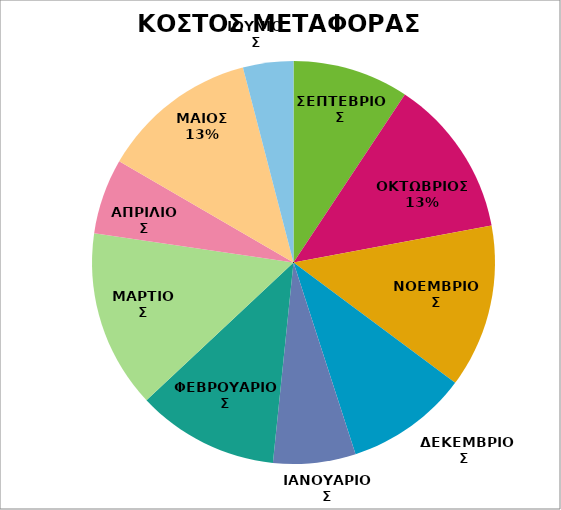
| Category | Series 0 |
|---|---|
| ΣΕΠΤΕΒΡΙΟΣ | 1703.48 |
| ΟΚΤΩΒΡΙΟΣ  | 2327.75 |
| ΝΟΕΜΒΡΙΟΣ | 2398.66 |
| ΔΕΚΕΜΒΡΙΟΣ  | 1796.54 |
| ΙΑΝΟΥΑΡΙΟΣ | 1208.99 |
| ΦΕΒΡΟΥΑΡΙΟΣ | 2080.44 |
| ΜΑΡΤΙΟΣ | 2615.14 |
| ΑΠΡΙΛΙΟΣ | 1104.1 |
| ΜΑΙΟΣ | 2301.26 |
| ΙΟΥΝΙΟΣ | 738.17 |